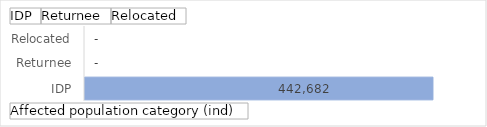
| Category | Total |
|---|---|
| IDP | 442682 |
| Returnee | 0 |
| Relocated | 0 |